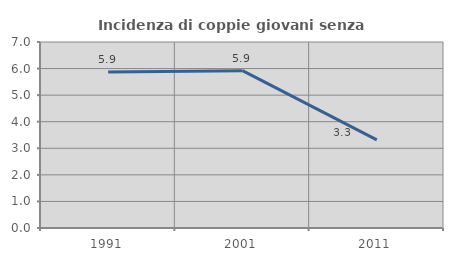
| Category | Incidenza di coppie giovani senza figli |
|---|---|
| 1991.0 | 5.868 |
| 2001.0 | 5.923 |
| 2011.0 | 3.319 |